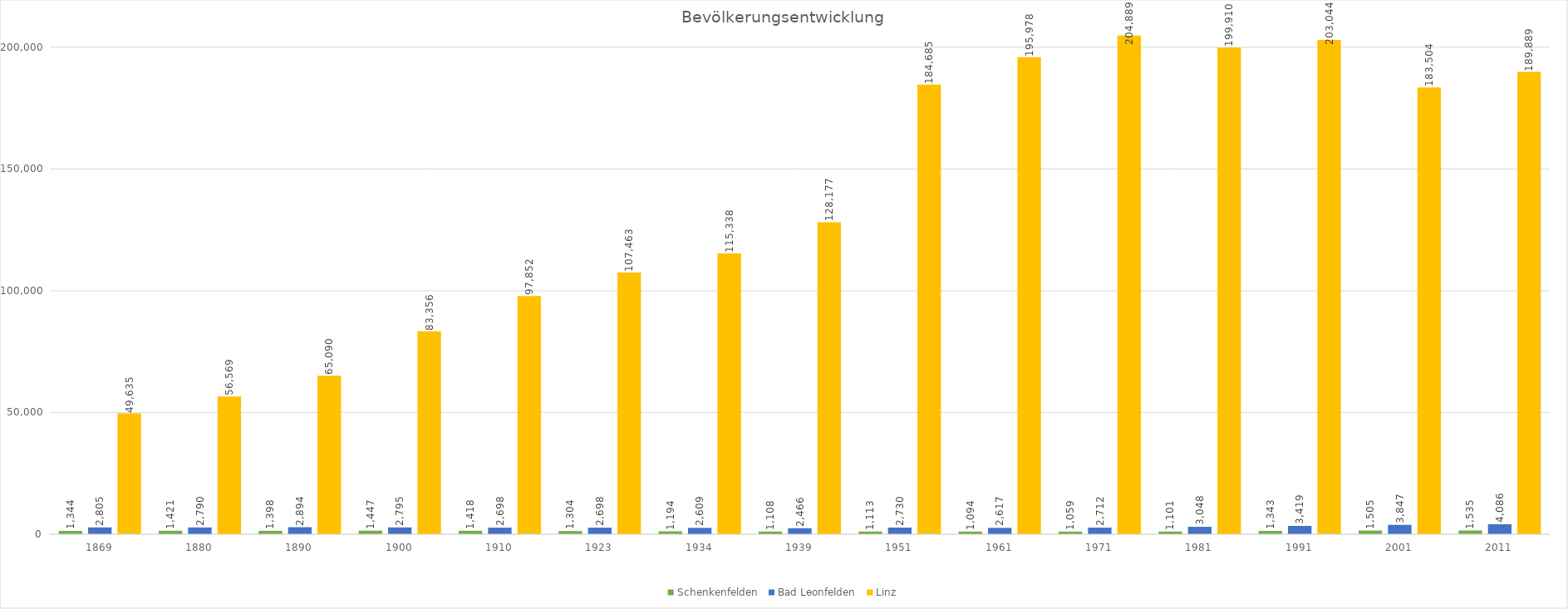
| Category | Schenkenfelden  | Bad Leonfelden  | Linz |
|---|---|---|---|
| 1869.0 | 1344 | 2805 | 49635 |
| 1880.0 | 1421 | 2790 | 56569 |
| 1890.0 | 1398 | 2894 | 65090 |
| 1900.0 | 1447 | 2795 | 83356 |
| 1910.0 | 1418 | 2698 | 97852 |
| 1923.0 | 1304 | 2698 | 107463 |
| 1934.0 | 1194 | 2609 | 115338 |
| 1939.0 | 1108 | 2466 | 128177 |
| 1951.0 | 1113 | 2730 | 184685 |
| 1961.0 | 1094 | 2617 | 195978 |
| 1971.0 | 1059 | 2712 | 204889 |
| 1981.0 | 1101 | 3048 | 199910 |
| 1991.0 | 1343 | 3419 | 203044 |
| 2001.0 | 1505 | 3847 | 183504 |
| 2011.0 | 1535 | 4086 | 189889 |